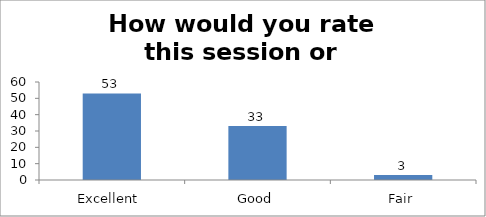
| Category | How would you rate this session or workshop? |
|---|---|
| Excellent  | 53 |
| Good | 33 |
| Fair | 3 |